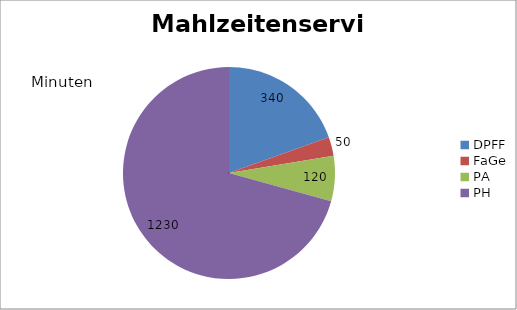
| Category | Mahlzeitenservice |
|---|---|
| DPFF | 340 |
| FaGe | 50 |
| PA | 120 |
| PH | 1230 |